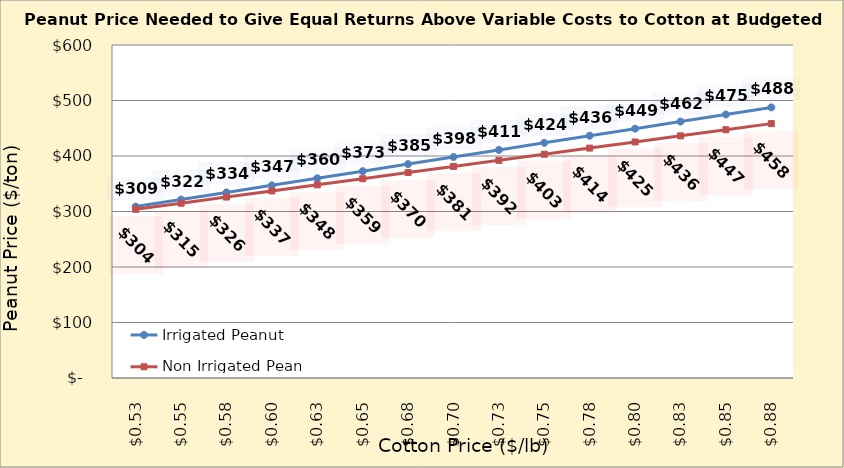
| Category | Irrigated Peanut | Non Irrigated Peanut |
|---|---|---|
| 0.5249999999999998 | 308.825 | 303.945 |
| 0.5499999999999998 | 321.59 | 314.975 |
| 0.5749999999999998 | 334.356 | 326.004 |
| 0.5999999999999999 | 347.122 | 337.034 |
| 0.6249999999999999 | 359.888 | 348.063 |
| 0.6499999999999999 | 372.654 | 359.092 |
| 0.6749999999999999 | 385.42 | 370.122 |
| 0.7 | 398.186 | 381.151 |
| 0.725 | 410.952 | 392.181 |
| 0.75 | 423.718 | 403.21 |
| 0.775 | 436.484 | 414.239 |
| 0.8 | 449.25 | 425.269 |
| 0.8250000000000001 | 462.016 | 436.298 |
| 0.8500000000000001 | 474.782 | 447.328 |
| 0.8750000000000001 | 487.548 | 458.357 |